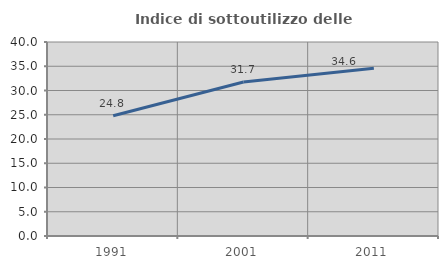
| Category | Indice di sottoutilizzo delle abitazioni  |
|---|---|
| 1991.0 | 24.786 |
| 2001.0 | 31.741 |
| 2011.0 | 34.565 |